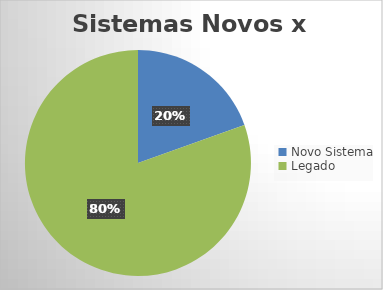
| Category | Coluna1 |
|---|---|
| Novo Sistema | 17 |
| Legado | 70 |